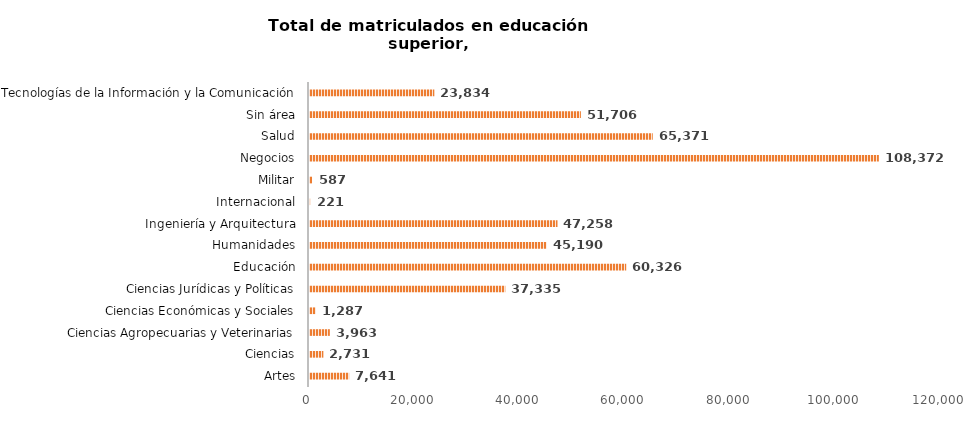
| Category | Series 0 |
|---|---|
| Artes | 7641 |
| Ciencias | 2731 |
| Ciencias Agropecuarias y Veterinarias | 3963 |
| Ciencias Económicas y Sociales | 1287 |
| Ciencias Jurídicas y Políticas | 37335 |
| Educación | 60326 |
| Humanidades | 45190 |
| Ingeniería y Arquitectura | 47258 |
| Internacional | 221 |
| Militar | 587 |
| Negocios | 108372 |
| Salud | 65371 |
| Sin área | 51706 |
| Tecnologías de la Información y la Comunicación | 23834 |